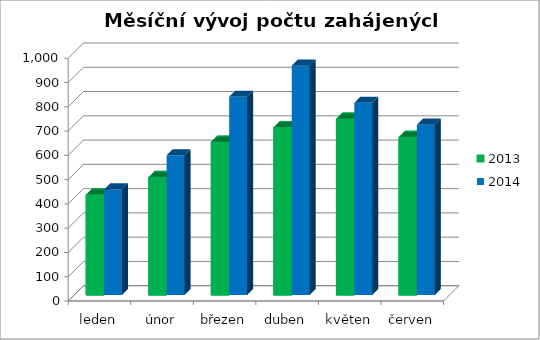
| Category | 2013 | 2014 |
|---|---|---|
| leden | 413 | 435 |
| únor | 485 | 576 |
| březen | 630 | 817 |
| duben | 690 | 945 |
| květen | 725 | 792 |
| červen | 650 | 702 |